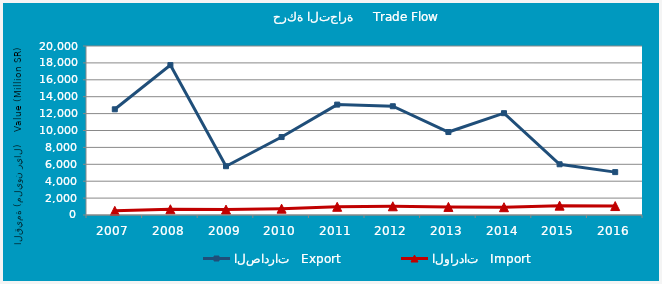
| Category | الصادرات   Export | الواردات   Import |
|---|---|---|
| 2007.0 | 12510.426 | 493.326 |
| 2008.0 | 17741.8 | 676.014 |
| 2009.0 | 5773.469 | 639.666 |
| 2010.0 | 9225.763 | 749.703 |
| 2011.0 | 13064.418 | 971.815 |
| 2012.0 | 12869.969 | 1030.289 |
| 2013.0 | 9818.478 | 957.638 |
| 2014.0 | 12049.905 | 921.791 |
| 2015.0 | 6003.818 | 1103.974 |
| 2016.0 | 5075.332 | 1059.371 |